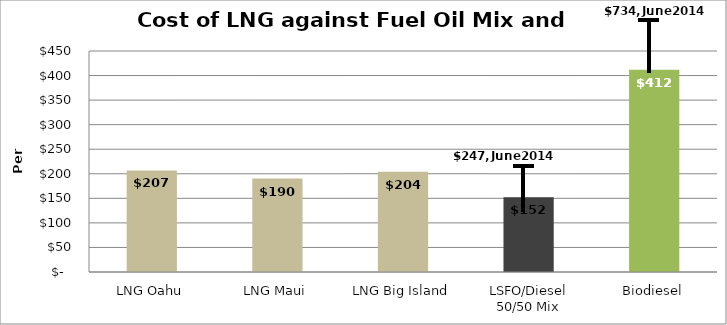
| Category | Series 0 |
|---|---|
| LNG Oahu | 206.677 |
| LNG Maui | 190.268 |
| LNG Big Island | 203.964 |
| LSFO/Diesel 50/50 Mix | 152 |
| Biodiesel | 412 |